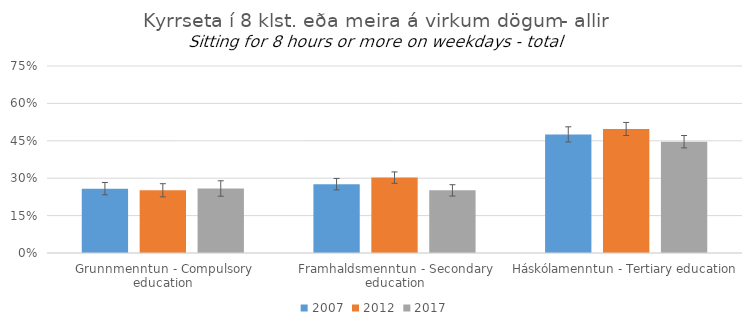
| Category | 2007 | 2012 | 2017 |
|---|---|---|---|
| Grunnmenntun - Compulsory education | 0.258 | 0.252 | 0.259 |
| Framhaldsmenntun - Secondary education | 0.276 | 0.302 | 0.251 |
| Háskólamenntun - Tertiary education | 0.476 | 0.497 | 0.446 |